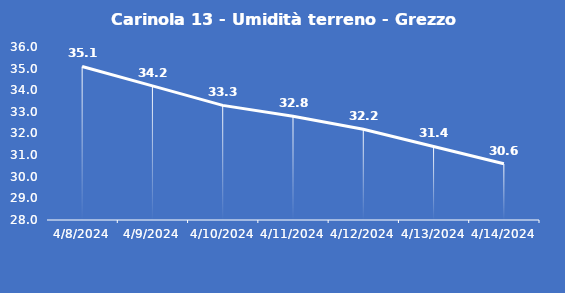
| Category | Carinola 13 - Umidità terreno - Grezzo (%VWC) |
|---|---|
| 4/8/24 | 35.1 |
| 4/9/24 | 34.2 |
| 4/10/24 | 33.3 |
| 4/11/24 | 32.8 |
| 4/12/24 | 32.2 |
| 4/13/24 | 31.4 |
| 4/14/24 | 30.6 |